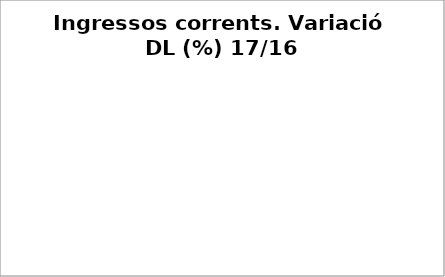
| Category | Series 0 |
|---|---|
| Impostos locals | 0.028 |
| Participació Tributs de l'Estat | 0 |
| Taxes i altres ingressos | -0.075 |
| Transferències corrents (exc. FCF) | 0.869 |
| Ingressos patrimonials | 0.142 |
| Ingressos corrents | 0.021 |